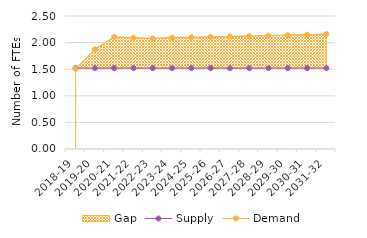
| Category | Supply | Demand |
|---|---|---|
| 2018-19 | 1.52 | 1.507 |
| 2019-20 | 1.52 | 1.876 |
| 2020-21 | 1.52 | 2.106 |
| 2021-22 | 1.52 | 2.091 |
| 2022-23 | 1.52 | 2.077 |
| 2023-24 | 1.52 | 2.092 |
| 2024-25 | 1.52 | 2.099 |
| 2025-26 | 1.52 | 2.106 |
| 2026-27 | 1.52 | 2.114 |
| 2027-28 | 1.52 | 2.122 |
| 2028-29 | 1.52 | 2.131 |
| 2029-30 | 1.52 | 2.14 |
| 2030-31 | 1.52 | 2.15 |
| 2031-32 | 1.52 | 2.159 |